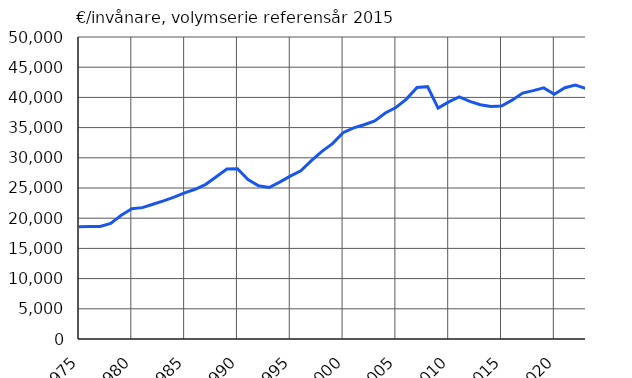
| Category | €/invånare, volymserie referensår 2015 |
|---|---|
| 1975 | 18576 |
| 1976 | 18613 |
| 1977 | 18621 |
| 1978 | 19152 |
| 1979 | 20475 |
| 1980 | 21561 |
| 1981 | 21751 |
| 1982 | 22302 |
| 1983 | 22860 |
| 1984 | 23475 |
| 1985 | 24207 |
| 1986 | 24793 |
| 1987 | 25607 |
| 1988 | 26864 |
| 1989 | 28129 |
| 1990 | 28193 |
| 1991 | 26389 |
| 1992 | 25376 |
| 1993 | 25087 |
| 1994 | 25969 |
| 1995 | 26961 |
| 1996 | 27858 |
| 1997 | 29535 |
| 1998 | 31064 |
| 1999 | 32349 |
| 2000 | 34145 |
| 2001 | 34957 |
| 2002 | 35468 |
| 2003 | 36092 |
| 2004 | 37424 |
| 2005 | 38333 |
| 2006 | 39724 |
| 2007 | 41652 |
| 2008 | 41783 |
| 2009 | 38226 |
| 2010 | 39263 |
| 2011 | 40078 |
| 2012 | 39330 |
| 2013 | 38796 |
| 2014 | 38488 |
| 2015 | 38570 |
| 2016 | 39548 |
| 2017 | 40715 |
| 2018 | 41119 |
| 2019 | 41582 |
| 2020 | 40536 |
| 2021 | 41605 |
| 2022* | 42044 |
| 2023* | 41456 |